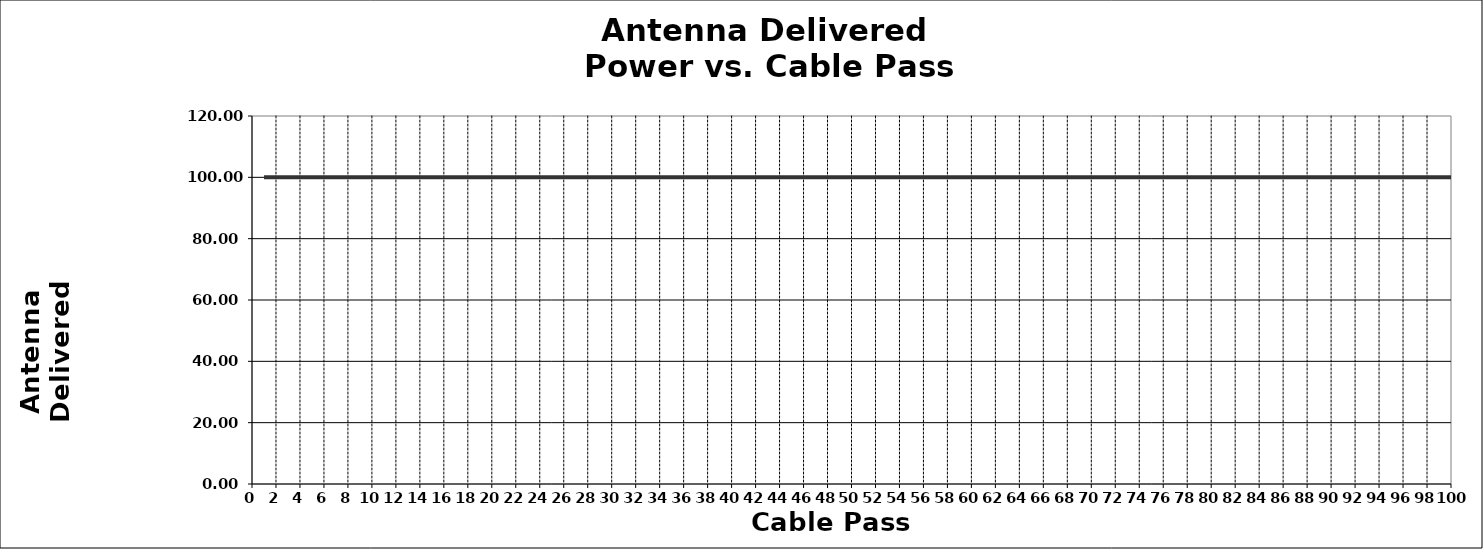
| Category | Series 0 |
|---|---|
| 1.0 | 99.999 |
| 2.0 | 99.999 |
| 3.0 | 99.999 |
| 4.0 | 99.999 |
| 5.0 | 99.999 |
| 6.0 | 99.999 |
| 7.0 | 99.999 |
| 8.0 | 99.999 |
| 9.0 | 99.999 |
| 10.0 | 99.999 |
| 11.0 | 99.999 |
| 12.0 | 99.999 |
| 13.0 | 99.999 |
| 14.0 | 99.999 |
| 15.0 | 99.999 |
| 16.0 | 99.999 |
| 17.0 | 99.999 |
| 18.0 | 99.999 |
| 19.0 | 99.999 |
| 20.0 | 99.999 |
| 21.0 | 99.999 |
| 22.0 | 99.999 |
| 23.0 | 99.999 |
| 24.0 | 99.999 |
| 25.0 | 99.999 |
| 26.0 | 99.999 |
| 27.0 | 99.999 |
| 28.0 | 99.999 |
| 29.0 | 99.999 |
| 30.0 | 99.999 |
| 31.0 | 99.999 |
| 32.0 | 99.999 |
| 33.0 | 99.999 |
| 34.0 | 99.999 |
| 35.0 | 99.999 |
| 36.0 | 99.999 |
| 37.0 | 99.999 |
| 38.0 | 99.999 |
| 39.0 | 99.999 |
| 40.0 | 99.999 |
| 41.0 | 99.999 |
| 42.0 | 99.999 |
| 43.0 | 99.999 |
| 44.0 | 99.999 |
| 45.0 | 99.999 |
| 46.0 | 99.999 |
| 47.0 | 99.999 |
| 48.0 | 99.999 |
| 49.0 | 99.999 |
| 50.0 | 99.999 |
| 51.0 | 99.999 |
| 52.0 | 99.999 |
| 53.0 | 99.999 |
| 54.0 | 99.999 |
| 55.0 | 99.999 |
| 56.0 | 99.999 |
| 57.0 | 99.999 |
| 58.0 | 99.999 |
| 59.0 | 99.999 |
| 60.0 | 99.999 |
| 61.0 | 99.999 |
| 62.0 | 99.999 |
| 63.0 | 99.999 |
| 64.0 | 99.999 |
| 65.0 | 99.999 |
| 66.0 | 99.999 |
| 67.0 | 99.999 |
| 68.0 | 99.999 |
| 69.0 | 99.999 |
| 70.0 | 99.999 |
| 71.0 | 99.999 |
| 72.0 | 99.999 |
| 73.0 | 99.999 |
| 74.0 | 99.999 |
| 75.0 | 99.999 |
| 76.0 | 99.999 |
| 77.0 | 99.999 |
| 78.0 | 99.999 |
| 79.0 | 99.999 |
| 80.0 | 99.999 |
| 81.0 | 99.999 |
| 82.0 | 99.999 |
| 83.0 | 99.999 |
| 84.0 | 99.999 |
| 85.0 | 99.999 |
| 86.0 | 99.999 |
| 87.0 | 99.999 |
| 88.0 | 99.999 |
| 89.0 | 99.999 |
| 90.0 | 99.999 |
| 91.0 | 99.999 |
| 92.0 | 99.999 |
| 93.0 | 99.999 |
| 94.0 | 99.999 |
| 95.0 | 99.999 |
| 96.0 | 99.999 |
| 97.0 | 99.999 |
| 98.0 | 99.999 |
| 99.0 | 99.999 |
| 100.0 | 99.999 |
| 101.0 | 99.999 |
| 102.0 | 99.999 |
| 103.0 | 99.999 |
| 104.0 | 99.999 |
| 105.0 | 99.999 |
| 106.0 | 99.999 |
| 107.0 | 99.999 |
| 108.0 | 99.999 |
| 109.0 | 99.999 |
| 110.0 | 99.999 |
| 111.0 | 99.999 |
| 112.0 | 99.999 |
| 113.0 | 99.999 |
| 114.0 | 99.999 |
| 115.0 | 99.999 |
| 116.0 | 99.999 |
| 117.0 | 99.999 |
| 118.0 | 99.999 |
| 119.0 | 99.999 |
| 120.0 | 99.999 |
| 121.0 | 99.999 |
| 122.0 | 99.999 |
| 123.0 | 99.999 |
| 124.0 | 99.999 |
| 125.0 | 99.999 |
| 126.0 | 99.999 |
| 127.0 | 99.999 |
| 128.0 | 99.999 |
| 129.0 | 99.999 |
| 130.0 | 99.999 |
| 131.0 | 99.999 |
| 132.0 | 99.999 |
| 133.0 | 99.999 |
| 134.0 | 99.999 |
| 135.0 | 99.999 |
| 136.0 | 99.999 |
| 137.0 | 99.999 |
| 138.0 | 99.999 |
| 139.0 | 99.999 |
| 140.0 | 99.999 |
| 141.0 | 99.999 |
| 142.0 | 99.999 |
| 143.0 | 99.999 |
| 144.0 | 99.999 |
| 145.0 | 99.999 |
| 146.0 | 99.999 |
| 147.0 | 99.999 |
| 148.0 | 99.999 |
| 149.0 | 99.999 |
| 150.0 | 99.999 |
| 151.0 | 99.999 |
| 152.0 | 99.999 |
| 153.0 | 99.999 |
| 154.0 | 99.999 |
| 155.0 | 99.999 |
| 156.0 | 99.999 |
| 157.0 | 99.999 |
| 158.0 | 99.999 |
| 159.0 | 99.999 |
| 160.0 | 99.999 |
| 161.0 | 99.999 |
| 162.0 | 99.999 |
| 163.0 | 99.999 |
| 164.0 | 99.999 |
| 165.0 | 99.999 |
| 166.0 | 99.999 |
| 167.0 | 99.999 |
| 168.0 | 99.999 |
| 169.0 | 99.999 |
| 170.0 | 99.999 |
| 171.0 | 99.999 |
| 172.0 | 99.999 |
| 173.0 | 99.999 |
| 174.0 | 99.999 |
| 175.0 | 99.999 |
| 176.0 | 99.999 |
| 177.0 | 99.999 |
| 178.0 | 99.999 |
| 179.0 | 99.999 |
| 180.0 | 99.999 |
| 181.0 | 99.999 |
| 182.0 | 99.999 |
| 183.0 | 99.999 |
| 184.0 | 99.999 |
| 185.0 | 99.999 |
| 186.0 | 99.999 |
| 187.0 | 99.999 |
| 188.0 | 99.999 |
| 189.0 | 99.999 |
| 190.0 | 99.999 |
| 191.0 | 99.999 |
| 192.0 | 99.999 |
| 193.0 | 99.999 |
| 194.0 | 99.999 |
| 195.0 | 99.999 |
| 196.0 | 99.999 |
| 197.0 | 99.999 |
| 198.0 | 99.999 |
| 199.0 | 99.999 |
| 200.0 | 99.999 |
| 201.0 | 99.999 |
| 202.0 | 99.999 |
| 203.0 | 99.999 |
| 204.0 | 99.999 |
| 205.0 | 99.999 |
| 206.0 | 99.999 |
| 207.0 | 99.999 |
| 208.0 | 99.999 |
| 209.0 | 99.999 |
| 210.0 | 99.999 |
| 211.0 | 99.999 |
| 212.0 | 99.999 |
| 213.0 | 99.999 |
| 214.0 | 99.999 |
| 215.0 | 99.999 |
| 216.0 | 99.999 |
| 217.0 | 99.999 |
| 218.0 | 99.999 |
| 219.0 | 99.999 |
| 220.0 | 99.999 |
| 221.0 | 99.999 |
| 222.0 | 99.999 |
| 223.0 | 99.999 |
| 224.0 | 99.999 |
| 225.0 | 99.999 |
| 226.0 | 99.999 |
| 227.0 | 99.999 |